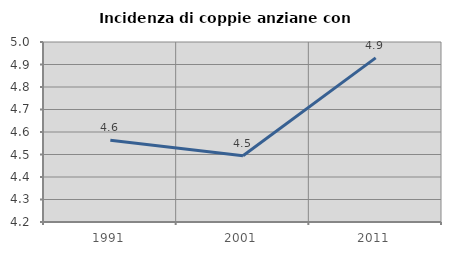
| Category | Incidenza di coppie anziane con figli |
|---|---|
| 1991.0 | 4.563 |
| 2001.0 | 4.494 |
| 2011.0 | 4.93 |